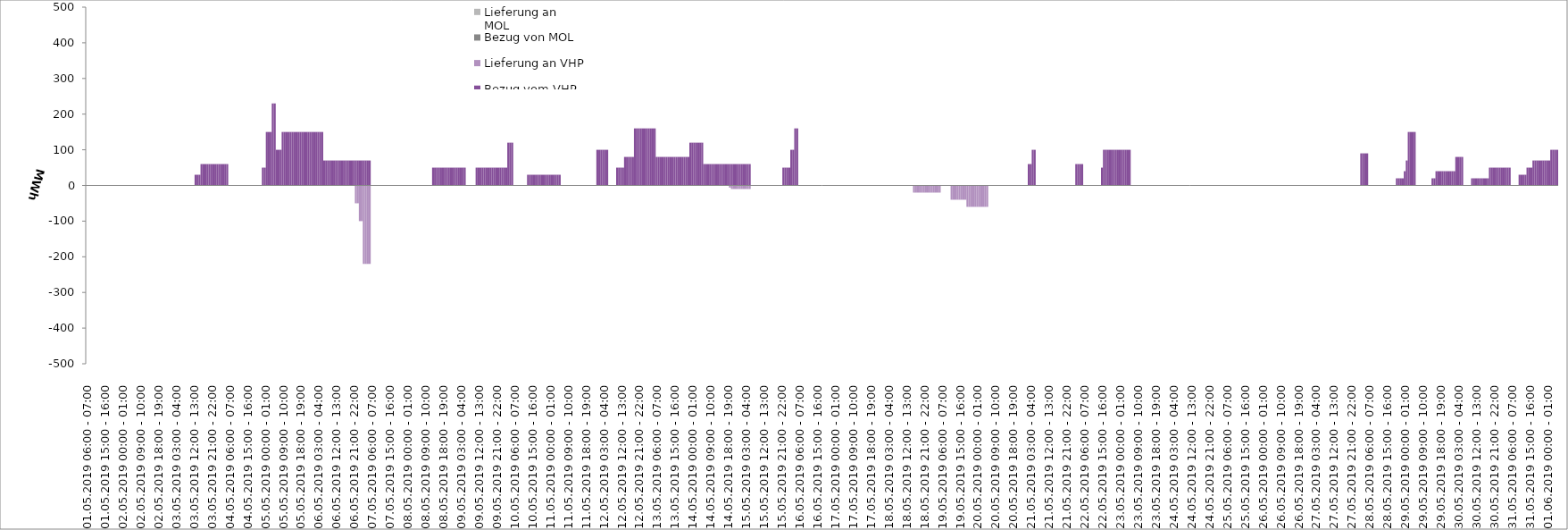
| Category | Bezug vom VHP | Lieferung an VHP | Bezug von MOL | Lieferung an MOL |
|---|---|---|---|---|
| 01.05.2019 06:00 - 07:00 | 0 | 0 | 0 | 0 |
| 01.05.2019 07:00 - 08:00 | 0 | 0 | 0 | 0 |
| 01.05.2019 08:00 - 09:00 | 0 | 0 | 0 | 0 |
| 01.05.2019 09:00 - 10:00 | 0 | 0 | 0 | 0 |
| 01.05.2019 10:00 - 11:00 | 0 | 0 | 0 | 0 |
| 01.05.2019 11:00 - 12:00 | 0 | 0 | 0 | 0 |
| 01.05.2019 12:00 - 13:00 | 0 | 0 | 0 | 0 |
| 01.05.2019 13:00 - 14:00 | 0 | 0 | 0 | 0 |
| 01.05.2019 14:00 - 15:00 | 0 | 0 | 0 | 0 |
| 01.05.2019 15:00 - 16:00 | 0 | 0 | 0 | 0 |
| 01.05.2019 16:00 - 17:00 | 0 | 0 | 0 | 0 |
| 01.05.2019 17:00 - 18:00 | 0 | 0 | 0 | 0 |
| 01.05.2019 18:00 - 19:00 | 0 | 0 | 0 | 0 |
| 01.05.2019 19:00 - 20:00 | 0 | 0 | 0 | 0 |
| 01.05.2019 20:00 - 21:00 | 0 | 0 | 0 | 0 |
| 01.05.2019 21:00 - 22:00 | 0 | 0 | 0 | 0 |
| 01.05.2019 22:00 - 23:00 | 0 | 0 | 0 | 0 |
| 01.05.2019 23:00 - 24:00 | 0 | 0 | 0 | 0 |
| 02.05.2019 00:00 - 01:00 | 0 | 0 | 0 | 0 |
| 02.05.2019 01:00 - 02:00 | 0 | 0 | 0 | 0 |
| 02.05.2019 02:00 - 03:00 | 0 | 0 | 0 | 0 |
| 02.05.2019 03:00 - 04:00 | 0 | 0 | 0 | 0 |
| 02.05.2019 04:00 - 05:00 | 0 | 0 | 0 | 0 |
| 02.05.2019 05:00 - 06:00 | 0 | 0 | 0 | 0 |
| 02.05.2019 06:00 - 07:00 | 0 | 0 | 0 | 0 |
| 02.05.2019 07:00 - 08:00 | 0 | 0 | 0 | 0 |
| 02.05.2019 08:00 - 09:00 | 0 | 0 | 0 | 0 |
| 02.05.2019 09:00 - 10:00 | 0 | 0 | 0 | 0 |
| 02.05.2019 10:00 - 11:00 | 0 | 0 | 0 | 0 |
| 02.05.2019 11:00 - 12:00 | 0 | 0 | 0 | 0 |
| 02.05.2019 12:00 - 13:00 | 0 | 0 | 0 | 0 |
| 02.05.2019 13:00 - 14:00 | 0 | 0 | 0 | 0 |
| 02.05.2019 14:00 - 15:00 | 0 | 0 | 0 | 0 |
| 02.05.2019 15:00 - 16:00 | 0 | 0 | 0 | 0 |
| 02.05.2019 16:00 - 17:00 | 0 | 0 | 0 | 0 |
| 02.05.2019 17:00 - 18:00 | 0 | 0 | 0 | 0 |
| 02.05.2019 18:00 - 19:00 | 0 | 0 | 0 | 0 |
| 02.05.2019 19:00 - 20:00 | 0 | 0 | 0 | 0 |
| 02.05.2019 20:00 - 21:00 | 0 | 0 | 0 | 0 |
| 02.05.2019 21:00 - 22:00 | 0 | 0 | 0 | 0 |
| 02.05.2019 22:00 - 23:00 | 0 | 0 | 0 | 0 |
| 02.05.2019 23:00 - 24:00 | 0 | 0 | 0 | 0 |
| 03.05.2019 00:00 - 01:00 | 0 | 0 | 0 | 0 |
| 03.05.2019 01:00 - 02:00 | 0 | 0 | 0 | 0 |
| 03.05.2019 02:00 - 03:00 | 0 | 0 | 0 | 0 |
| 03.05.2019 03:00 - 04:00 | 0 | 0 | 0 | 0 |
| 03.05.2019 04:00 - 05:00 | 0 | 0 | 0 | 0 |
| 03.05.2019 05:00 - 06:00 | 0 | 0 | 0 | 0 |
| 03.05.2019 06:00 - 07:00 | 0 | 0 | 0 | 0 |
| 03.05.2019 07:00 - 08:00 | 0 | 0 | 0 | 0 |
| 03.05.2019 08:00 - 09:00 | 0 | 0 | 0 | 0 |
| 03.05.2019 09:00 - 10:00 | 0 | 0 | 0 | 0 |
| 03.05.2019 10:00 - 11:00 | 0 | 0 | 0 | 0 |
| 03.05.2019 11:00 - 12:00 | 0 | 0 | 0 | 0 |
| 03.05.2019 12:00 - 13:00 | 0 | 0 | 0 | 0 |
| 03.05.2019 13:00 - 14:00 | 30 | 0 | 0 | 0 |
| 03.05.2019 14:00 - 15:00 | 30 | 0 | 0 | 0 |
| 03.05.2019 15:00 - 16:00 | 30 | 0 | 0 | 0 |
| 03.05.2019 16:00 - 17:00 | 60 | 0 | 0 | 0 |
| 03.05.2019 17:00 - 18:00 | 60 | 0 | 0 | 0 |
| 03.05.2019 18:00 - 19:00 | 60 | 0 | 0 | 0 |
| 03.05.2019 19:00 - 20:00 | 60 | 0 | 0 | 0 |
| 03.05.2019 20:00 - 21:00 | 60 | 0 | 0 | 0 |
| 03.05.2019 21:00 - 22:00 | 60 | 0 | 0 | 0 |
| 03.05.2019 22:00 - 23:00 | 60 | 0 | 0 | 0 |
| 03.05.2019 23:00 - 24:00 | 60 | 0 | 0 | 0 |
| 04.05.2019 00:00 - 01:00 | 60 | 0 | 0 | 0 |
| 04.05.2019 01:00 - 02:00 | 60 | 0 | 0 | 0 |
| 04.05.2019 02:00 - 03:00 | 60 | 0 | 0 | 0 |
| 04.05.2019 03:00 - 04:00 | 60 | 0 | 0 | 0 |
| 04.05.2019 04:00 - 05:00 | 60 | 0 | 0 | 0 |
| 04.05.2019 05:00 - 06:00 | 60 | 0 | 0 | 0 |
| 04.05.2019 06:00 - 07:00 | 0 | 0 | 0 | 0 |
| 04.05.2019 07:00 - 08:00 | 0 | 0 | 0 | 0 |
| 04.05.2019 08:00 - 09:00 | 0 | 0 | 0 | 0 |
| 04.05.2019 09:00 - 10:00 | 0 | 0 | 0 | 0 |
| 04.05.2019 10:00 - 11:00 | 0 | 0 | 0 | 0 |
| 04.05.2019 11:00 - 12:00 | 0 | 0 | 0 | 0 |
| 04.05.2019 12:00 - 13:00 | 0 | 0 | 0 | 0 |
| 04.05.2019 13:00 - 14:00 | 0 | 0 | 0 | 0 |
| 04.05.2019 14:00 - 15:00 | 0 | 0 | 0 | 0 |
| 04.05.2019 15:00 - 16:00 | 0 | 0 | 0 | 0 |
| 04.05.2019 16:00 - 17:00 | 0 | 0 | 0 | 0 |
| 04.05.2019 17:00 - 18:00 | 0 | 0 | 0 | 0 |
| 04.05.2019 18:00 - 19:00 | 0 | 0 | 0 | 0 |
| 04.05.2019 19:00 - 20:00 | 0 | 0 | 0 | 0 |
| 04.05.2019 20:00 - 21:00 | 0 | 0 | 0 | 0 |
| 04.05.2019 21:00 - 22:00 | 0 | 0 | 0 | 0 |
| 04.05.2019 22:00 - 23:00 | 0 | 0 | 0 | 0 |
| 04.05.2019 23:00 - 24:00 | 50 | 0 | 0 | 0 |
| 05.05.2019 00:00 - 01:00 | 50 | 0 | 0 | 0 |
| 05.05.2019 01:00 - 02:00 | 150 | 0 | 0 | 0 |
| 05.05.2019 02:00 - 03:00 | 150 | 0 | 0 | 0 |
| 05.05.2019 03:00 - 04:00 | 150 | 0 | 0 | 0 |
| 05.05.2019 04:00 - 05:00 | 230 | 0 | 0 | 0 |
| 05.05.2019 05:00 - 06:00 | 230 | 0 | 0 | 0 |
| 05.05.2019 06:00 - 07:00 | 100 | 0 | 0 | 0 |
| 05.05.2019 07:00 - 08:00 | 100 | 0 | 0 | 0 |
| 05.05.2019 08:00 - 09:00 | 100 | 0 | 0 | 0 |
| 05.05.2019 09:00 - 10:00 | 150 | 0 | 0 | 0 |
| 05.05.2019 10:00 - 11:00 | 150 | 0 | 0 | 0 |
| 05.05.2019 11:00 - 12:00 | 150 | 0 | 0 | 0 |
| 05.05.2019 12:00 - 13:00 | 150 | 0 | 0 | 0 |
| 05.05.2019 13:00 - 14:00 | 150 | 0 | 0 | 0 |
| 05.05.2019 14:00 - 15:00 | 150 | 0 | 0 | 0 |
| 05.05.2019 15:00 - 16:00 | 150 | 0 | 0 | 0 |
| 05.05.2019 16:00 - 17:00 | 150 | 0 | 0 | 0 |
| 05.05.2019 17:00 - 18:00 | 150 | 0 | 0 | 0 |
| 05.05.2019 18:00 - 19:00 | 150 | 0 | 0 | 0 |
| 05.05.2019 19:00 - 20:00 | 150 | 0 | 0 | 0 |
| 05.05.2019 20:00 - 21:00 | 150 | 0 | 0 | 0 |
| 05.05.2019 21:00 - 22:00 | 150 | 0 | 0 | 0 |
| 05.05.2019 22:00 - 23:00 | 150 | 0 | 0 | 0 |
| 05.05.2019 23:00 - 24:00 | 150 | 0 | 0 | 0 |
| 06.05.2019 00:00 - 01:00 | 150 | 0 | 0 | 0 |
| 06.05.2019 01:00 - 02:00 | 150 | 0 | 0 | 0 |
| 06.05.2019 02:00 - 03:00 | 150 | 0 | 0 | 0 |
| 06.05.2019 03:00 - 04:00 | 150 | 0 | 0 | 0 |
| 06.05.2019 04:00 - 05:00 | 150 | 0 | 0 | 0 |
| 06.05.2019 05:00 - 06:00 | 150 | 0 | 0 | 0 |
| 06.05.2019 06:00 - 07:00 | 70 | 0 | 0 | 0 |
| 06.05.2019 07:00 - 08:00 | 70 | 0 | 0 | 0 |
| 06.05.2019 08:00 - 09:00 | 70 | 0 | 0 | 0 |
| 06.05.2019 09:00 - 10:00 | 70 | 0 | 0 | 0 |
| 06.05.2019 10:00 - 11:00 | 70 | 0 | 0 | 0 |
| 06.05.2019 11:00 - 12:00 | 70 | 0 | 0 | 0 |
| 06.05.2019 12:00 - 13:00 | 70 | 0 | 0 | 0 |
| 06.05.2019 13:00 - 14:00 | 70 | 0 | 0 | 0 |
| 06.05.2019 14:00 - 15:00 | 70 | 0 | 0 | 0 |
| 06.05.2019 15:00 - 16:00 | 70 | 0 | 0 | 0 |
| 06.05.2019 16:00 - 17:00 | 70 | 0 | 0 | 0 |
| 06.05.2019 17:00 - 18:00 | 70 | 0 | 0 | 0 |
| 06.05.2019 18:00 - 19:00 | 70 | 0 | 0 | 0 |
| 06.05.2019 19:00 - 20:00 | 70 | 0 | 0 | 0 |
| 06.05.2019 20:00 - 21:00 | 70 | 0 | 0 | 0 |
| 06.05.2019 21:00 - 22:00 | 70 | 0 | 0 | 0 |
| 06.05.2019 22:00 - 23:00 | 70 | -50 | 0 | 0 |
| 06.05.2019 23:00 - 24:00 | 70 | -50 | 0 | 0 |
| 07.05.2019 00:00 - 01:00 | 70 | -100 | 0 | 0 |
| 07.05.2019 01:00 - 02:00 | 70 | -100 | 0 | 0 |
| 07.05.2019 02:00 - 03:00 | 70 | -220 | 0 | 0 |
| 07.05.2019 03:00 - 04:00 | 70 | -220 | 0 | 0 |
| 07.05.2019 04:00 - 05:00 | 70 | -220 | 0 | 0 |
| 07.05.2019 05:00 - 06:00 | 70 | -220 | 0 | 0 |
| 07.05.2019 06:00 - 07:00 | 0 | 0 | 0 | 0 |
| 07.05.2019 07:00 - 08:00 | 0 | 0 | 0 | 0 |
| 07.05.2019 08:00 - 09:00 | 0 | 0 | 0 | 0 |
| 07.05.2019 09:00 - 10:00 | 0 | 0 | 0 | 0 |
| 07.05.2019 10:00 - 11:00 | 0 | 0 | 0 | 0 |
| 07.05.2019 11:00 - 12:00 | 0 | 0 | 0 | 0 |
| 07.05.2019 12:00 - 13:00 | 0 | 0 | 0 | 0 |
| 07.05.2019 13:00 - 14:00 | 0 | 0 | 0 | 0 |
| 07.05.2019 14:00 - 15:00 | 0 | 0 | 0 | 0 |
| 07.05.2019 15:00 - 16:00 | 0 | 0 | 0 | 0 |
| 07.05.2019 16:00 - 17:00 | 0 | 0 | 0 | 0 |
| 07.05.2019 17:00 - 18:00 | 0 | 0 | 0 | 0 |
| 07.05.2019 18:00 - 19:00 | 0 | 0 | 0 | 0 |
| 07.05.2019 19:00 - 20:00 | 0 | 0 | 0 | 0 |
| 07.05.2019 20:00 - 21:00 | 0 | 0 | 0 | 0 |
| 07.05.2019 21:00 - 22:00 | 0 | 0 | 0 | 0 |
| 07.05.2019 22:00 - 23:00 | 0 | 0 | 0 | 0 |
| 07.05.2019 23:00 - 24:00 | 0 | 0 | 0 | 0 |
| 08.05.2019 00:00 - 01:00 | 0 | 0 | 0 | 0 |
| 08.05.2019 01:00 - 02:00 | 0 | 0 | 0 | 0 |
| 08.05.2019 02:00 - 03:00 | 0 | 0 | 0 | 0 |
| 08.05.2019 03:00 - 04:00 | 0 | 0 | 0 | 0 |
| 08.05.2019 04:00 - 05:00 | 0 | 0 | 0 | 0 |
| 08.05.2019 05:00 - 06:00 | 0 | 0 | 0 | 0 |
| 08.05.2019 06:00 - 07:00 | 0 | 0 | 0 | 0 |
| 08.05.2019 07:00 - 08:00 | 0 | 0 | 0 | 0 |
| 08.05.2019 08:00 - 09:00 | 0 | 0 | 0 | 0 |
| 08.05.2019 09:00 - 10:00 | 0 | 0 | 0 | 0 |
| 08.05.2019 10:00 - 11:00 | 0 | 0 | 0 | 0 |
| 08.05.2019 11:00 - 12:00 | 0 | 0 | 0 | 0 |
| 08.05.2019 12:00 - 13:00 | 0 | 0 | 0 | 0 |
| 08.05.2019 13:00 - 14:00 | 50 | 0 | 0 | 0 |
| 08.05.2019 14:00 - 15:00 | 50 | 0 | 0 | 0 |
| 08.05.2019 15:00 - 16:00 | 50 | 0 | 0 | 0 |
| 08.05.2019 16:00 - 17:00 | 50 | 0 | 0 | 0 |
| 08.05.2019 17:00 - 18:00 | 50 | 0 | 0 | 0 |
| 08.05.2019 18:00 - 19:00 | 50 | 0 | 0 | 0 |
| 08.05.2019 19:00 - 20:00 | 50 | 0 | 0 | 0 |
| 08.05.2019 20:00 - 21:00 | 50 | 0 | 0 | 0 |
| 08.05.2019 21:00 - 22:00 | 50 | 0 | 0 | 0 |
| 08.05.2019 22:00 - 23:00 | 50 | 0 | 0 | 0 |
| 08.05.2019 23:00 - 24:00 | 50 | 0 | 0 | 0 |
| 09.05.2019 00:00 - 01:00 | 50 | 0 | 0 | 0 |
| 09.05.2019 01:00 - 02:00 | 50 | 0 | 0 | 0 |
| 09.05.2019 02:00 - 03:00 | 50 | 0 | 0 | 0 |
| 09.05.2019 03:00 - 04:00 | 50 | 0 | 0 | 0 |
| 09.05.2019 04:00 - 05:00 | 50 | 0 | 0 | 0 |
| 09.05.2019 05:00 - 06:00 | 50 | 0 | 0 | 0 |
| 09.05.2019 06:00 - 07:00 | 0 | 0 | 0 | 0 |
| 09.05.2019 07:00 - 08:00 | 0 | 0 | 0 | 0 |
| 09.05.2019 08:00 - 09:00 | 0 | 0 | 0 | 0 |
| 09.05.2019 09:00 - 10:00 | 0 | 0 | 0 | 0 |
| 09.05.2019 10:00 - 11:00 | 0 | 0 | 0 | 0 |
| 09.05.2019 11:00 - 12:00 | 50 | 0 | 0 | 0 |
| 09.05.2019 12:00 - 13:00 | 50 | 0 | 0 | 0 |
| 09.05.2019 13:00 - 14:00 | 50 | 0 | 0 | 0 |
| 09.05.2019 14:00 - 15:00 | 50 | 0 | 0 | 0 |
| 09.05.2019 15:00 - 16:00 | 50 | 0 | 0 | 0 |
| 09.05.2019 16:00 - 17:00 | 50 | 0 | 0 | 0 |
| 09.05.2019 17:00 - 18:00 | 50 | 0 | 0 | 0 |
| 09.05.2019 18:00 - 19:00 | 50 | 0 | 0 | 0 |
| 09.05.2019 19:00 - 20:00 | 50 | 0 | 0 | 0 |
| 09.05.2019 20:00 - 21:00 | 50 | 0 | 0 | 0 |
| 09.05.2019 21:00 - 22:00 | 50 | 0 | 0 | 0 |
| 09.05.2019 22:00 - 23:00 | 50 | 0 | 0 | 0 |
| 09.05.2019 23:00 - 24:00 | 50 | 0 | 0 | 0 |
| 10.05.2019 00:00 - 01:00 | 50 | 0 | 0 | 0 |
| 10.05.2019 01:00 - 02:00 | 50 | 0 | 0 | 0 |
| 10.05.2019 02:00 - 03:00 | 50 | 0 | 0 | 0 |
| 10.05.2019 03:00 - 04:00 | 120 | 0 | 0 | 0 |
| 10.05.2019 04:00 - 05:00 | 120 | 0 | 0 | 0 |
| 10.05.2019 05:00 - 06:00 | 120 | 0 | 0 | 0 |
| 10.05.2019 06:00 - 07:00 | 0 | 0 | 0 | 0 |
| 10.05.2019 07:00 - 08:00 | 0 | 0 | 0 | 0 |
| 10.05.2019 08:00 - 09:00 | 0 | 0 | 0 | 0 |
| 10.05.2019 09:00 - 10:00 | 0 | 0 | 0 | 0 |
| 10.05.2019 10:00 - 11:00 | 0 | 0 | 0 | 0 |
| 10.05.2019 11:00 - 12:00 | 0 | 0 | 0 | 0 |
| 10.05.2019 12:00 - 13:00 | 0 | 0 | 0 | 0 |
| 10.05.2019 13:00 - 14:00 | 30 | 0 | 0 | 0 |
| 10.05.2019 14:00 - 15:00 | 30 | 0 | 0 | 0 |
| 10.05.2019 15:00 - 16:00 | 30 | 0 | 0 | 0 |
| 10.05.2019 16:00 - 17:00 | 30 | 0 | 0 | 0 |
| 10.05.2019 17:00 - 18:00 | 30 | 0 | 0 | 0 |
| 10.05.2019 18:00 - 19:00 | 30 | 0 | 0 | 0 |
| 10.05.2019 19:00 - 20:00 | 30 | 0 | 0 | 0 |
| 10.05.2019 20:00 - 21:00 | 30 | 0 | 0 | 0 |
| 10.05.2019 21:00 - 22:00 | 30 | 0 | 0 | 0 |
| 10.05.2019 22:00 - 23:00 | 30 | 0 | 0 | 0 |
| 10.05.2019 23:00 - 24:00 | 30 | 0 | 0 | 0 |
| 11.05.2019 00:00 - 01:00 | 30 | 0 | 0 | 0 |
| 11.05.2019 01:00 - 02:00 | 30 | 0 | 0 | 0 |
| 11.05.2019 02:00 - 03:00 | 30 | 0 | 0 | 0 |
| 11.05.2019 03:00 - 04:00 | 30 | 0 | 0 | 0 |
| 11.05.2019 04:00 - 05:00 | 30 | 0 | 0 | 0 |
| 11.05.2019 05:00 - 06:00 | 30 | 0 | 0 | 0 |
| 11.05.2019 06:00 - 07:00 | 0 | 0 | 0 | 0 |
| 11.05.2019 07:00 - 08:00 | 0 | 0 | 0 | 0 |
| 11.05.2019 08:00 - 09:00 | 0 | 0 | 0 | 0 |
| 11.05.2019 09:00 - 10:00 | 0 | 0 | 0 | 0 |
| 11.05.2019 10:00 - 11:00 | 0 | 0 | 0 | 0 |
| 11.05.2019 11:00 - 12:00 | 0 | 0 | 0 | 0 |
| 11.05.2019 12:00 - 13:00 | 0 | 0 | 0 | 0 |
| 11.05.2019 13:00 - 14:00 | 0 | 0 | 0 | 0 |
| 11.05.2019 14:00 - 15:00 | 0 | 0 | 0 | 0 |
| 11.05.2019 15:00 - 16:00 | 0 | 0 | 0 | 0 |
| 11.05.2019 16:00 - 17:00 | 0 | 0 | 0 | 0 |
| 11.05.2019 17:00 - 18:00 | 0 | 0 | 0 | 0 |
| 11.05.2019 18:00 - 19:00 | 0 | 0 | 0 | 0 |
| 11.05.2019 19:00 - 20:00 | 0 | 0 | 0 | 0 |
| 11.05.2019 20:00 - 21:00 | 0 | 0 | 0 | 0 |
| 11.05.2019 21:00 - 22:00 | 0 | 0 | 0 | 0 |
| 11.05.2019 22:00 - 23:00 | 0 | 0 | 0 | 0 |
| 11.05.2019 23:00 - 24:00 | 0 | 0 | 0 | 0 |
| 12.05.2019 00:00 - 01:00 | 100 | 0 | 0 | 0 |
| 12.05.2019 01:00 - 02:00 | 100 | 0 | 0 | 0 |
| 12.05.2019 02:00 - 03:00 | 100 | 0 | 0 | 0 |
| 12.05.2019 03:00 - 04:00 | 100 | 0 | 0 | 0 |
| 12.05.2019 04:00 - 05:00 | 100 | 0 | 0 | 0 |
| 12.05.2019 05:00 - 06:00 | 100 | 0 | 0 | 0 |
| 12.05.2019 06:00 - 07:00 | 0 | 0 | 0 | 0 |
| 12.05.2019 07:00 - 08:00 | 0 | 0 | 0 | 0 |
| 12.05.2019 08:00 - 09:00 | 0 | 0 | 0 | 0 |
| 12.05.2019 09:00 - 10:00 | 0 | 0 | 0 | 0 |
| 12.05.2019 10:00 - 11:00 | 50 | 0 | 0 | 0 |
| 12.05.2019 11:00 - 12:00 | 50 | 0 | 0 | 0 |
| 12.05.2019 12:00 - 13:00 | 50 | 0 | 0 | 0 |
| 12.05.2019 13:00 - 14:00 | 50 | 0 | 0 | 0 |
| 12.05.2019 14:00 - 15:00 | 80 | 0 | 0 | 0 |
| 12.05.2019 15:00 - 16:00 | 80 | 0 | 0 | 0 |
| 12.05.2019 16:00 - 17:00 | 80 | 0 | 0 | 0 |
| 12.05.2019 17:00 - 18:00 | 80 | 0 | 0 | 0 |
| 12.05.2019 18:00 - 19:00 | 80 | 0 | 0 | 0 |
| 12.05.2019 19:00 - 20:00 | 160 | 0 | 0 | 0 |
| 12.05.2019 20:00 - 21:00 | 160 | 0 | 0 | 0 |
| 12.05.2019 21:00 - 22:00 | 160 | 0 | 0 | 0 |
| 12.05.2019 22:00 - 23:00 | 160 | 0 | 0 | 0 |
| 12.05.2019 23:00 - 24:00 | 160 | 0 | 0 | 0 |
| 13.05.2019 00:00 - 01:00 | 160 | 0 | 0 | 0 |
| 13.05.2019 01:00 - 02:00 | 160 | 0 | 0 | 0 |
| 13.05.2019 02:00 - 03:00 | 160 | 0 | 0 | 0 |
| 13.05.2019 03:00 - 04:00 | 160 | 0 | 0 | 0 |
| 13.05.2019 04:00 - 05:00 | 160 | 0 | 0 | 0 |
| 13.05.2019 05:00 - 06:00 | 160 | 0 | 0 | 0 |
| 13.05.2019 06:00 - 07:00 | 80 | 0 | 0 | 0 |
| 13.05.2019 07:00 - 08:00 | 80 | 0 | 0 | 0 |
| 13.05.2019 08:00 - 09:00 | 80 | 0 | 0 | 0 |
| 13.05.2019 09:00 - 10:00 | 80 | 0 | 0 | 0 |
| 13.05.2019 10:00 - 11:00 | 80 | 0 | 0 | 0 |
| 13.05.2019 11:00 - 12:00 | 80 | 0 | 0 | 0 |
| 13.05.2019 12:00 - 13:00 | 80 | 0 | 0 | 0 |
| 13.05.2019 13:00 - 14:00 | 80 | 0 | 0 | 0 |
| 13.05.2019 14:00 - 15:00 | 80 | 0 | 0 | 0 |
| 13.05.2019 15:00 - 16:00 | 80 | 0 | 0 | 0 |
| 13.05.2019 16:00 - 17:00 | 80 | 0 | 0 | 0 |
| 13.05.2019 17:00 - 18:00 | 80 | 0 | 0 | 0 |
| 13.05.2019 18:00 - 19:00 | 80 | 0 | 0 | 0 |
| 13.05.2019 19:00 - 20:00 | 80 | 0 | 0 | 0 |
| 13.05.2019 20:00 - 21:00 | 80 | 0 | 0 | 0 |
| 13.05.2019 21:00 - 22:00 | 80 | 0 | 0 | 0 |
| 13.05.2019 22:00 - 23:00 | 80 | 0 | 0 | 0 |
| 13.05.2019 23:00 - 24:00 | 120 | 0 | 0 | 0 |
| 14.05.2019 00:00 - 01:00 | 120 | 0 | 0 | 0 |
| 14.05.2019 01:00 - 02:00 | 120 | 0 | 0 | 0 |
| 14.05.2019 02:00 - 03:00 | 120 | 0 | 0 | 0 |
| 14.05.2019 03:00 - 04:00 | 120 | 0 | 0 | 0 |
| 14.05.2019 04:00 - 05:00 | 120 | 0 | 0 | 0 |
| 14.05.2019 05:00 - 06:00 | 120 | 0 | 0 | 0 |
| 14.05.2019 06:00 - 07:00 | 60 | 0 | 0 | 0 |
| 14.05.2019 07:00 - 08:00 | 60 | 0 | 0 | 0 |
| 14.05.2019 08:00 - 09:00 | 60 | 0 | 0 | 0 |
| 14.05.2019 09:00 - 10:00 | 60 | 0 | 0 | 0 |
| 14.05.2019 10:00 - 11:00 | 60 | 0 | 0 | 0 |
| 14.05.2019 11:00 - 12:00 | 60 | 0 | 0 | 0 |
| 14.05.2019 12:00 - 13:00 | 60 | 0 | 0 | 0 |
| 14.05.2019 13:00 - 14:00 | 60 | 0 | 0 | 0 |
| 14.05.2019 14:00 - 15:00 | 60 | 0 | 0 | 0 |
| 14.05.2019 15:00 - 16:00 | 60 | 0 | 0 | 0 |
| 14.05.2019 16:00 - 17:00 | 60 | 0 | 0 | 0 |
| 14.05.2019 17:00 - 18:00 | 60 | 0 | 0 | 0 |
| 14.05.2019 18:00 - 19:00 | 60 | 0 | 0 | 0 |
| 14.05.2019 19:00 - 20:00 | 60 | -6 | 0 | 0 |
| 14.05.2019 20:00 - 21:00 | 60 | -10 | 0 | 0 |
| 14.05.2019 21:00 - 22:00 | 60 | -10 | 0 | 0 |
| 14.05.2019 22:00 - 23:00 | 60 | -10 | 0 | 0 |
| 14.05.2019 23:00 - 24:00 | 60 | -10 | 0 | 0 |
| 15.05.2019 00:00 - 01:00 | 60 | -10 | 0 | 0 |
| 15.05.2019 01:00 - 02:00 | 60 | -10 | 0 | 0 |
| 15.05.2019 02:00 - 03:00 | 60 | -10 | 0 | 0 |
| 15.05.2019 03:00 - 04:00 | 60 | -10 | 0 | 0 |
| 15.05.2019 04:00 - 05:00 | 60 | -10 | 0 | 0 |
| 15.05.2019 05:00 - 06:00 | 60 | -10 | 0 | 0 |
| 15.05.2019 06:00 - 07:00 | 0 | 0 | 0 | 0 |
| 15.05.2019 07:00 - 08:00 | 0 | 0 | 0 | 0 |
| 15.05.2019 08:00 - 09:00 | 0 | 0 | 0 | 0 |
| 15.05.2019 09:00 - 10:00 | 0 | 0 | 0 | 0 |
| 15.05.2019 10:00 - 11:00 | 0 | 0 | 0 | 0 |
| 15.05.2019 11:00 - 12:00 | 0 | 0 | 0 | 0 |
| 15.05.2019 12:00 - 13:00 | 0 | 0 | 0 | 0 |
| 15.05.2019 13:00 - 14:00 | 0 | 0 | 0 | 0 |
| 15.05.2019 14:00 - 15:00 | 0 | 0 | 0 | 0 |
| 15.05.2019 15:00 - 16:00 | 0 | 0 | 0 | 0 |
| 15.05.2019 16:00 - 17:00 | 0 | 0 | 0 | 0 |
| 15.05.2019 17:00 - 18:00 | 0 | 0 | 0 | 0 |
| 15.05.2019 18:00 - 19:00 | 0 | 0 | 0 | 0 |
| 15.05.2019 19:00 - 20:00 | 0 | 0 | 0 | 0 |
| 15.05.2019 20:00 - 21:00 | 0 | 0 | 0 | 0 |
| 15.05.2019 21:00 - 22:00 | 0 | 0 | 0 | 0 |
| 15.05.2019 22:00 - 23:00 | 50 | 0 | 0 | 0 |
| 15.05.2019 23:00 - 24:00 | 50 | 0 | 0 | 0 |
| 16.05.2019 00:00 - 01:00 | 50 | 0 | 0 | 0 |
| 16.05.2019 01:00 - 02:00 | 50 | 0 | 0 | 0 |
| 16.05.2019 02:00 - 03:00 | 100 | 0 | 0 | 0 |
| 16.05.2019 03:00 - 04:00 | 100 | 0 | 0 | 0 |
| 16.05.2019 04:00 - 05:00 | 160 | 0 | 0 | 0 |
| 16.05.2019 05:00 - 06:00 | 160 | 0 | 0 | 0 |
| 16.05.2019 06:00 - 07:00 | 0 | 0 | 0 | 0 |
| 16.05.2019 07:00 - 08:00 | 0 | 0 | 0 | 0 |
| 16.05.2019 08:00 - 09:00 | 0 | 0 | 0 | 0 |
| 16.05.2019 09:00 - 10:00 | 0 | 0 | 0 | 0 |
| 16.05.2019 10:00 - 11:00 | 0 | 0 | 0 | 0 |
| 16.05.2019 11:00 - 12:00 | 0 | 0 | 0 | 0 |
| 16.05.2019 12:00 - 13:00 | 0 | 0 | 0 | 0 |
| 16.05.2019 13:00 - 14:00 | 0 | 0 | 0 | 0 |
| 16.05.2019 14:00 - 15:00 | 0 | 0 | 0 | 0 |
| 16.05.2019 15:00 - 16:00 | 0 | 0 | 0 | 0 |
| 16.05.2019 16:00 - 17:00 | 0 | 0 | 0 | 0 |
| 16.05.2019 17:00 - 18:00 | 0 | 0 | 0 | 0 |
| 16.05.2019 18:00 - 19:00 | 0 | 0 | 0 | 0 |
| 16.05.2019 19:00 - 20:00 | 0 | 0 | 0 | 0 |
| 16.05.2019 20:00 - 21:00 | 0 | 0 | 0 | 0 |
| 16.05.2019 21:00 - 22:00 | 0 | 0 | 0 | 0 |
| 16.05.2019 22:00 - 23:00 | 0 | 0 | 0 | 0 |
| 16.05.2019 23:00 - 24:00 | 0 | 0 | 0 | 0 |
| 17.05.2019 00:00 - 01:00 | 0 | 0 | 0 | 0 |
| 17.05.2019 01:00 - 02:00 | 0 | 0 | 0 | 0 |
| 17.05.2019 02:00 - 03:00 | 0 | 0 | 0 | 0 |
| 17.05.2019 03:00 - 04:00 | 0 | 0 | 0 | 0 |
| 17.05.2019 04:00 - 05:00 | 0 | 0 | 0 | 0 |
| 17.05.2019 05:00 - 06:00 | 0 | 0 | 0 | 0 |
| 17.05.2019 06:00 - 07:00 | 0 | 0 | 0 | 0 |
| 17.05.2019 07:00 - 08:00 | 0 | 0 | 0 | 0 |
| 17.05.2019 08:00 - 09:00 | 0 | 0 | 0 | 0 |
| 17.05.2019 09:00 - 10:00 | 0 | 0 | 0 | 0 |
| 17.05.2019 10:00 - 11:00 | 0 | 0 | 0 | 0 |
| 17.05.2019 11:00 - 12:00 | 0 | 0 | 0 | 0 |
| 17.05.2019 12:00 - 13:00 | 0 | 0 | 0 | 0 |
| 17.05.2019 13:00 - 14:00 | 0 | 0 | 0 | 0 |
| 17.05.2019 14:00 - 15:00 | 0 | 0 | 0 | 0 |
| 17.05.2019 15:00 - 16:00 | 0 | 0 | 0 | 0 |
| 17.05.2019 16:00 - 17:00 | 0 | 0 | 0 | 0 |
| 17.05.2019 17:00 - 18:00 | 0 | 0 | 0 | 0 |
| 17.05.2019 18:00 - 19:00 | 0 | 0 | 0 | 0 |
| 17.05.2019 19:00 - 20:00 | 0 | 0 | 0 | 0 |
| 17.05.2019 20:00 - 21:00 | 0 | 0 | 0 | 0 |
| 17.05.2019 21:00 - 22:00 | 0 | 0 | 0 | 0 |
| 17.05.2019 22:00 - 23:00 | 0 | 0 | 0 | 0 |
| 17.05.2019 23:00 - 24:00 | 0 | 0 | 0 | 0 |
| 18.05.2019 00:00 - 01:00 | 0 | 0 | 0 | 0 |
| 18.05.2019 01:00 - 02:00 | 0 | 0 | 0 | 0 |
| 18.05.2019 02:00 - 03:00 | 0 | 0 | 0 | 0 |
| 18.05.2019 03:00 - 04:00 | 0 | 0 | 0 | 0 |
| 18.05.2019 04:00 - 05:00 | 0 | 0 | 0 | 0 |
| 18.05.2019 05:00 - 06:00 | 0 | 0 | 0 | 0 |
| 18.05.2019 06:00 - 07:00 | 0 | 0 | 0 | 0 |
| 18.05.2019 07:00 - 08:00 | 0 | 0 | 0 | 0 |
| 18.05.2019 08:00 - 09:00 | 0 | 0 | 0 | 0 |
| 18.05.2019 09:00 - 10:00 | 0 | 0 | 0 | 0 |
| 18.05.2019 10:00 - 11:00 | 0 | 0 | 0 | 0 |
| 18.05.2019 11:00 - 12:00 | 0 | 0 | 0 | 0 |
| 18.05.2019 12:00 - 13:00 | 0 | 0 | 0 | 0 |
| 18.05.2019 13:00 - 14:00 | 0 | 0 | 0 | 0 |
| 18.05.2019 14:00 - 15:00 | 0 | 0 | 0 | 0 |
| 18.05.2019 15:00 - 16:00 | 0 | 0 | 0 | 0 |
| 18.05.2019 16:00 - 17:00 | 0 | -20 | 0 | 0 |
| 18.05.2019 17:00 - 18:00 | 0 | -20 | 0 | 0 |
| 18.05.2019 18:00 - 19:00 | 0 | -20 | 0 | 0 |
| 18.05.2019 19:00 - 20:00 | 0 | -20 | 0 | 0 |
| 18.05.2019 20:00 - 21:00 | 0 | -20 | 0 | 0 |
| 18.05.2019 21:00 - 22:00 | 0 | -20 | 0 | 0 |
| 18.05.2019 22:00 - 23:00 | 0 | -20 | 0 | 0 |
| 18.05.2019 23:00 - 24:00 | 0 | -20 | 0 | 0 |
| 19.05.2019 00:00 - 01:00 | 0 | -20 | 0 | 0 |
| 19.05.2019 01:00 - 02:00 | 0 | -20 | 0 | 0 |
| 19.05.2019 02:00 - 03:00 | 0 | -20 | 0 | 0 |
| 19.05.2019 03:00 - 04:00 | 0 | -20 | 0 | 0 |
| 19.05.2019 04:00 - 05:00 | 0 | -20 | 0 | 0 |
| 19.05.2019 05:00 - 06:00 | 0 | -20 | 0 | 0 |
| 19.05.2019 06:00 - 07:00 | 0 | 0 | 0 | 0 |
| 19.05.2019 07:00 - 08:00 | 0 | 0 | 0 | 0 |
| 19.05.2019 08:00 - 09:00 | 0 | 0 | 0 | 0 |
| 19.05.2019 09:00 - 10:00 | 0 | 0 | 0 | 0 |
| 19.05.2019 10:00 - 11:00 | 0 | 0 | 0 | 0 |
| 19.05.2019 11:00 - 12:00 | 0 | -40 | 0 | 0 |
| 19.05.2019 12:00 - 13:00 | 0 | -40 | 0 | 0 |
| 19.05.2019 13:00 - 14:00 | 0 | -40 | 0 | 0 |
| 19.05.2019 14:00 - 15:00 | 0 | -40 | 0 | 0 |
| 19.05.2019 15:00 - 16:00 | 0 | -40 | 0 | 0 |
| 19.05.2019 16:00 - 17:00 | 0 | -40 | 0 | 0 |
| 19.05.2019 17:00 - 18:00 | 0 | -40 | 0 | 0 |
| 19.05.2019 18:00 - 19:00 | 0 | -40 | 0 | 0 |
| 19.05.2019 19:00 - 20:00 | 0 | -60 | 0 | 0 |
| 19.05.2019 20:00 - 21:00 | 0 | -60 | 0 | 0 |
| 19.05.2019 21:00 - 22:00 | 0 | -60 | 0 | 0 |
| 19.05.2019 22:00 - 23:00 | 0 | -60 | 0 | 0 |
| 19.05.2019 23:00 - 24:00 | 0 | -60 | 0 | 0 |
| 20.05.2019 00:00 - 01:00 | 0 | -60 | 0 | 0 |
| 20.05.2019 01:00 - 02:00 | 0 | -60 | 0 | 0 |
| 20.05.2019 02:00 - 03:00 | 0 | -60 | 0 | 0 |
| 20.05.2019 03:00 - 04:00 | 0 | -60 | 0 | 0 |
| 20.05.2019 04:00 - 05:00 | 0 | -60 | 0 | 0 |
| 20.05.2019 05:00 - 06:00 | 0 | -60 | 0 | 0 |
| 20.05.2019 06:00 - 07:00 | 0 | 0 | 0 | 0 |
| 20.05.2019 07:00 - 08:00 | 0 | 0 | 0 | 0 |
| 20.05.2019 08:00 - 09:00 | 0 | 0 | 0 | 0 |
| 20.05.2019 09:00 - 10:00 | 0 | 0 | 0 | 0 |
| 20.05.2019 10:00 - 11:00 | 0 | 0 | 0 | 0 |
| 20.05.2019 11:00 - 12:00 | 0 | 0 | 0 | 0 |
| 20.05.2019 12:00 - 13:00 | 0 | 0 | 0 | 0 |
| 20.05.2019 13:00 - 14:00 | 0 | 0 | 0 | 0 |
| 20.05.2019 14:00 - 15:00 | 0 | 0 | 0 | 0 |
| 20.05.2019 15:00 - 16:00 | 0 | 0 | 0 | 0 |
| 20.05.2019 16:00 - 17:00 | 0 | 0 | 0 | 0 |
| 20.05.2019 17:00 - 18:00 | 0 | 0 | 0 | 0 |
| 20.05.2019 18:00 - 19:00 | 0 | 0 | 0 | 0 |
| 20.05.2019 19:00 - 20:00 | 0 | 0 | 0 | 0 |
| 20.05.2019 20:00 - 21:00 | 0 | 0 | 0 | 0 |
| 20.05.2019 21:00 - 22:00 | 0 | 0 | 0 | 0 |
| 20.05.2019 22:00 - 23:00 | 0 | 0 | 0 | 0 |
| 20.05.2019 23:00 - 24:00 | 0 | 0 | 0 | 0 |
| 21.05.2019 00:00 - 01:00 | 0 | 0 | 0 | 0 |
| 21.05.2019 01:00 - 02:00 | 0 | 0 | 0 | 0 |
| 21.05.2019 02:00 - 03:00 | 60 | 0 | 0 | 0 |
| 21.05.2019 03:00 - 04:00 | 60 | 0 | 0 | 0 |
| 21.05.2019 04:00 - 05:00 | 100 | 0 | 0 | 0 |
| 21.05.2019 05:00 - 06:00 | 100 | 0 | 0 | 0 |
| 21.05.2019 06:00 - 07:00 | 0 | 0 | 0 | 0 |
| 21.05.2019 07:00 - 08:00 | 0 | 0 | 0 | 0 |
| 21.05.2019 08:00 - 09:00 | 0 | 0 | 0 | 0 |
| 21.05.2019 09:00 - 10:00 | 0 | 0 | 0 | 0 |
| 21.05.2019 10:00 - 11:00 | 0 | 0 | 0 | 0 |
| 21.05.2019 11:00 - 12:00 | 0 | 0 | 0 | 0 |
| 21.05.2019 12:00 - 13:00 | 0 | 0 | 0 | 0 |
| 21.05.2019 13:00 - 14:00 | 0 | 0 | 0 | 0 |
| 21.05.2019 14:00 - 15:00 | 0 | 0 | 0 | 0 |
| 21.05.2019 15:00 - 16:00 | 0 | 0 | 0 | 0 |
| 21.05.2019 16:00 - 17:00 | 0 | 0 | 0 | 0 |
| 21.05.2019 17:00 - 18:00 | 0 | 0 | 0 | 0 |
| 21.05.2019 18:00 - 19:00 | 0 | 0 | 0 | 0 |
| 21.05.2019 19:00 - 20:00 | 0 | 0 | 0 | 0 |
| 21.05.2019 20:00 - 21:00 | 0 | 0 | 0 | 0 |
| 21.05.2019 21:00 - 22:00 | 0 | 0 | 0 | 0 |
| 21.05.2019 22:00 - 23:00 | 0 | 0 | 0 | 0 |
| 21.05.2019 23:00 - 24:00 | 0 | 0 | 0 | 0 |
| 22.05.2019 00:00 - 01:00 | 0 | 0 | 0 | 0 |
| 22.05.2019 01:00 - 02:00 | 0 | 0 | 0 | 0 |
| 22.05.2019 02:00 - 03:00 | 60 | 0 | 0 | 0 |
| 22.05.2019 03:00 - 04:00 | 60 | 0 | 0 | 0 |
| 22.05.2019 04:00 - 05:00 | 60 | 0 | 0 | 0 |
| 22.05.2019 05:00 - 06:00 | 60 | 0 | 0 | 0 |
| 22.05.2019 06:00 - 07:00 | 0 | 0 | 0 | 0 |
| 22.05.2019 07:00 - 08:00 | 0 | 0 | 0 | 0 |
| 22.05.2019 08:00 - 09:00 | 0 | 0 | 0 | 0 |
| 22.05.2019 09:00 - 10:00 | 0 | 0 | 0 | 0 |
| 22.05.2019 10:00 - 11:00 | 0 | 0 | 0 | 0 |
| 22.05.2019 11:00 - 12:00 | 0 | 0 | 0 | 0 |
| 22.05.2019 12:00 - 13:00 | 0 | 0 | 0 | 0 |
| 22.05.2019 13:00 - 14:00 | 0 | 0 | 0 | 0 |
| 22.05.2019 14:00 - 15:00 | 0 | 0 | 0 | 0 |
| 22.05.2019 15:00 - 16:00 | 50 | 0 | 0 | 0 |
| 22.05.2019 16:00 - 17:00 | 100 | 0 | 0 | 0 |
| 22.05.2019 17:00 - 18:00 | 100 | 0 | 0 | 0 |
| 22.05.2019 18:00 - 19:00 | 100 | 0 | 0 | 0 |
| 22.05.2019 19:00 - 20:00 | 100 | 0 | 0 | 0 |
| 22.05.2019 20:00 - 21:00 | 100 | 0 | 0 | 0 |
| 22.05.2019 21:00 - 22:00 | 100 | 0 | 0 | 0 |
| 22.05.2019 22:00 - 23:00 | 100 | 0 | 0 | 0 |
| 22.05.2019 23:00 - 24:00 | 100 | 0 | 0 | 0 |
| 23.05.2019 00:00 - 01:00 | 100 | 0 | 0 | 0 |
| 23.05.2019 01:00 - 02:00 | 100 | 0 | 0 | 0 |
| 23.05.2019 02:00 - 03:00 | 100 | 0 | 0 | 0 |
| 23.05.2019 03:00 - 04:00 | 100 | 0 | 0 | 0 |
| 23.05.2019 04:00 - 05:00 | 100 | 0 | 0 | 0 |
| 23.05.2019 05:00 - 06:00 | 100 | 0 | 0 | 0 |
| 23.05.2019 06:00 - 07:00 | 0 | 0 | 0 | 0 |
| 23.05.2019 07:00 - 08:00 | 0 | 0 | 0 | 0 |
| 23.05.2019 08:00 - 09:00 | 0 | 0 | 0 | 0 |
| 23.05.2019 09:00 - 10:00 | 0 | 0 | 0 | 0 |
| 23.05.2019 10:00 - 11:00 | 0 | 0 | 0 | 0 |
| 23.05.2019 11:00 - 12:00 | 0 | 0 | 0 | 0 |
| 23.05.2019 12:00 - 13:00 | 0 | 0 | 0 | 0 |
| 23.05.2019 13:00 - 14:00 | 0 | 0 | 0 | 0 |
| 23.05.2019 14:00 - 15:00 | 0 | 0 | 0 | 0 |
| 23.05.2019 15:00 - 16:00 | 0 | 0 | 0 | 0 |
| 23.05.2019 16:00 - 17:00 | 0 | 0 | 0 | 0 |
| 23.05.2019 17:00 - 18:00 | 0 | 0 | 0 | 0 |
| 23.05.2019 18:00 - 19:00 | 0 | 0 | 0 | 0 |
| 23.05.2019 19:00 - 20:00 | 0 | 0 | 0 | 0 |
| 23.05.2019 20:00 - 21:00 | 0 | 0 | 0 | 0 |
| 23.05.2019 21:00 - 22:00 | 0 | 0 | 0 | 0 |
| 23.05.2019 22:00 - 23:00 | 0 | 0 | 0 | 0 |
| 23.05.2019 23:00 - 24:00 | 0 | 0 | 0 | 0 |
| 24.05.2019 00:00 - 01:00 | 0 | 0 | 0 | 0 |
| 24.05.2019 01:00 - 02:00 | 0 | 0 | 0 | 0 |
| 24.05.2019 02:00 - 03:00 | 0 | 0 | 0 | 0 |
| 24.05.2019 03:00 - 04:00 | 0 | 0 | 0 | 0 |
| 24.05.2019 04:00 - 05:00 | 0 | 0 | 0 | 0 |
| 24.05.2019 05:00 - 06:00 | 0 | 0 | 0 | 0 |
| 24.05.2019 06:00 - 07:00 | 0 | 0 | 0 | 0 |
| 24.05.2019 07:00 - 08:00 | 0 | 0 | 0 | 0 |
| 24.05.2019 08:00 - 09:00 | 0 | 0 | 0 | 0 |
| 24.05.2019 09:00 - 10:00 | 0 | 0 | 0 | 0 |
| 24.05.2019 10:00 - 11:00 | 0 | 0 | 0 | 0 |
| 24.05.2019 11:00 - 12:00 | 0 | 0 | 0 | 0 |
| 24.05.2019 12:00 - 13:00 | 0 | 0 | 0 | 0 |
| 24.05.2019 13:00 - 14:00 | 0 | 0 | 0 | 0 |
| 24.05.2019 14:00 - 15:00 | 0 | 0 | 0 | 0 |
| 24.05.2019 15:00 - 16:00 | 0 | 0 | 0 | 0 |
| 24.05.2019 16:00 - 17:00 | 0 | 0 | 0 | 0 |
| 24.05.2019 17:00 - 18:00 | 0 | 0 | 0 | 0 |
| 24.05.2019 18:00 - 19:00 | 0 | 0 | 0 | 0 |
| 24.05.2019 19:00 - 20:00 | 0 | 0 | 0 | 0 |
| 24.05.2019 20:00 - 21:00 | 0 | 0 | 0 | 0 |
| 24.05.2019 21:00 - 22:00 | 0 | 0 | 0 | 0 |
| 24.05.2019 22:00 - 23:00 | 0 | 0 | 0 | 0 |
| 24.05.2019 23:00 - 24:00 | 0 | 0 | 0 | 0 |
| 25.05.2019 00:00 - 01:00 | 0 | 0 | 0 | 0 |
| 25.05.2019 01:00 - 02:00 | 0 | 0 | 0 | 0 |
| 25.05.2019 02:00 - 03:00 | 0 | 0 | 0 | 0 |
| 25.05.2019 03:00 - 04:00 | 0 | 0 | 0 | 0 |
| 25.05.2019 04:00 - 05:00 | 0 | 0 | 0 | 0 |
| 25.05.2019 05:00 - 06:00 | 0 | 0 | 0 | 0 |
| 25.05.2019 06:00 - 07:00 | 0 | 0 | 0 | 0 |
| 25.05.2019 07:00 - 08:00 | 0 | 0 | 0 | 0 |
| 25.05.2019 08:00 - 09:00 | 0 | 0 | 0 | 0 |
| 25.05.2019 09:00 - 10:00 | 0 | 0 | 0 | 0 |
| 25.05.2019 10:00 - 11:00 | 0 | 0 | 0 | 0 |
| 25.05.2019 11:00 - 12:00 | 0 | 0 | 0 | 0 |
| 25.05.2019 12:00 - 13:00 | 0 | 0 | 0 | 0 |
| 25.05.2019 13:00 - 14:00 | 0 | 0 | 0 | 0 |
| 25.05.2019 14:00 - 15:00 | 0 | 0 | 0 | 0 |
| 25.05.2019 15:00 - 16:00 | 0 | 0 | 0 | 0 |
| 25.05.2019 16:00 - 17:00 | 0 | 0 | 0 | 0 |
| 25.05.2019 17:00 - 18:00 | 0 | 0 | 0 | 0 |
| 25.05.2019 18:00 - 19:00 | 0 | 0 | 0 | 0 |
| 25.05.2019 19:00 - 20:00 | 0 | 0 | 0 | 0 |
| 25.05.2019 20:00 - 21:00 | 0 | 0 | 0 | 0 |
| 25.05.2019 21:00 - 22:00 | 0 | 0 | 0 | 0 |
| 25.05.2019 22:00 - 23:00 | 0 | 0 | 0 | 0 |
| 25.05.2019 23:00 - 24:00 | 0 | 0 | 0 | 0 |
| 26.05.2019 00:00 - 01:00 | 0 | 0 | 0 | 0 |
| 26.05.2019 01:00 - 02:00 | 0 | 0 | 0 | 0 |
| 26.05.2019 02:00 - 03:00 | 0 | 0 | 0 | 0 |
| 26.05.2019 03:00 - 04:00 | 0 | 0 | 0 | 0 |
| 26.05.2019 04:00 - 05:00 | 0 | 0 | 0 | 0 |
| 26.05.2019 05:00 - 06:00 | 0 | 0 | 0 | 0 |
| 26.05.2019 06:00 - 07:00 | 0 | 0 | 0 | 0 |
| 26.05.2019 07:00 - 08:00 | 0 | 0 | 0 | 0 |
| 26.05.2019 08:00 - 09:00 | 0 | 0 | 0 | 0 |
| 26.05.2019 09:00 - 10:00 | 0 | 0 | 0 | 0 |
| 26.05.2019 10:00 - 11:00 | 0 | 0 | 0 | 0 |
| 26.05.2019 11:00 - 12:00 | 0 | 0 | 0 | 0 |
| 26.05.2019 12:00 - 13:00 | 0 | 0 | 0 | 0 |
| 26.05.2019 13:00 - 14:00 | 0 | 0 | 0 | 0 |
| 26.05.2019 14:00 - 15:00 | 0 | 0 | 0 | 0 |
| 26.05.2019 15:00 - 16:00 | 0 | 0 | 0 | 0 |
| 26.05.2019 16:00 - 17:00 | 0 | 0 | 0 | 0 |
| 26.05.2019 17:00 - 18:00 | 0 | 0 | 0 | 0 |
| 26.05.2019 18:00 - 19:00 | 0 | 0 | 0 | 0 |
| 26.05.2019 19:00 - 20:00 | 0 | 0 | 0 | 0 |
| 26.05.2019 20:00 - 21:00 | 0 | 0 | 0 | 0 |
| 26.05.2019 21:00 - 22:00 | 0 | 0 | 0 | 0 |
| 26.05.2019 22:00 - 23:00 | 0 | 0 | 0 | 0 |
| 26.05.2019 23:00 - 24:00 | 0 | 0 | 0 | 0 |
| 27.05.2019 00:00 - 01:00 | 0 | 0 | 0 | 0 |
| 27.05.2019 01:00 - 02:00 | 0 | 0 | 0 | 0 |
| 27.05.2019 02:00 - 03:00 | 0 | 0 | 0 | 0 |
| 27.05.2019 03:00 - 04:00 | 0 | 0 | 0 | 0 |
| 27.05.2019 04:00 - 05:00 | 0 | 0 | 0 | 0 |
| 27.05.2019 05:00 - 06:00 | 0 | 0 | 0 | 0 |
| 27.05.2019 06:00 - 07:00 | 0 | 0 | 0 | 0 |
| 27.05.2019 07:00 - 08:00 | 0 | 0 | 0 | 0 |
| 27.05.2019 08:00 - 09:00 | 0 | 0 | 0 | 0 |
| 27.05.2019 09:00 - 10:00 | 0 | 0 | 0 | 0 |
| 27.05.2019 10:00 - 11:00 | 0 | 0 | 0 | 0 |
| 27.05.2019 11:00 - 12:00 | 0 | 0 | 0 | 0 |
| 27.05.2019 12:00 - 13:00 | 0 | 0 | 0 | 0 |
| 27.05.2019 13:00 - 14:00 | 0 | 0 | 0 | 0 |
| 27.05.2019 14:00 - 15:00 | 0 | 0 | 0 | 0 |
| 27.05.2019 15:00 - 16:00 | 0 | 0 | 0 | 0 |
| 27.05.2019 16:00 - 17:00 | 0 | 0 | 0 | 0 |
| 27.05.2019 17:00 - 18:00 | 0 | 0 | 0 | 0 |
| 27.05.2019 18:00 - 19:00 | 0 | 0 | 0 | 0 |
| 27.05.2019 19:00 - 20:00 | 0 | 0 | 0 | 0 |
| 27.05.2019 20:00 - 21:00 | 0 | 0 | 0 | 0 |
| 27.05.2019 21:00 - 22:00 | 0 | 0 | 0 | 0 |
| 27.05.2019 22:00 - 23:00 | 0 | 0 | 0 | 0 |
| 27.05.2019 23:00 - 24:00 | 0 | 0 | 0 | 0 |
| 28.05.2019 00:00 - 01:00 | 0 | 0 | 0 | 0 |
| 28.05.2019 01:00 - 02:00 | 0 | 0 | 0 | 0 |
| 28.05.2019 02:00 - 03:00 | 90 | 0 | 0 | 0 |
| 28.05.2019 03:00 - 04:00 | 90 | 0 | 0 | 0 |
| 28.05.2019 04:00 - 05:00 | 90 | 0 | 0 | 0 |
| 28.05.2019 05:00 - 06:00 | 90 | 0 | 0 | 0 |
| 28.05.2019 06:00 - 07:00 | 0 | 0 | 0 | 0 |
| 28.05.2019 07:00 - 08:00 | 0 | 0 | 0 | 0 |
| 28.05.2019 08:00 - 09:00 | 0 | 0 | 0 | 0 |
| 28.05.2019 09:00 - 10:00 | 0 | 0 | 0 | 0 |
| 28.05.2019 10:00 - 11:00 | 0 | 0 | 0 | 0 |
| 28.05.2019 11:00 - 12:00 | 0 | 0 | 0 | 0 |
| 28.05.2019 12:00 - 13:00 | 0 | 0 | 0 | 0 |
| 28.05.2019 13:00 - 14:00 | 0 | 0 | 0 | 0 |
| 28.05.2019 14:00 - 15:00 | 0 | 0 | 0 | 0 |
| 28.05.2019 15:00 - 16:00 | 0 | 0 | 0 | 0 |
| 28.05.2019 16:00 - 17:00 | 0 | 0 | 0 | 0 |
| 28.05.2019 17:00 - 18:00 | 0 | 0 | 0 | 0 |
| 28.05.2019 18:00 - 19:00 | 0 | 0 | 0 | 0 |
| 28.05.2019 19:00 - 20:00 | 0 | 0 | 0 | 0 |
| 28.05.2019 20:00 - 21:00 | 20 | 0 | 0 | 0 |
| 28.05.2019 21:00 - 22:00 | 20 | 0 | 0 | 0 |
| 28.05.2019 22:00 - 23:00 | 20 | 0 | 0 | 0 |
| 28.05.2019 23:00 - 24:00 | 20 | 0 | 0 | 0 |
| 29.05.2019 00:00 - 01:00 | 40 | 0 | 0 | 0 |
| 29.05.2019 01:00 - 02:00 | 70 | 0 | 0 | 0 |
| 29.05.2019 02:00 - 03:00 | 150 | 0 | 0 | 0 |
| 29.05.2019 03:00 - 04:00 | 150 | 0 | 0 | 0 |
| 29.05.2019 04:00 - 05:00 | 150 | 0 | 0 | 0 |
| 29.05.2019 05:00 - 06:00 | 150 | 0 | 0 | 0 |
| 29.05.2019 06:00 - 07:00 | 0 | 0 | 0 | 0 |
| 29.05.2019 07:00 - 08:00 | 0 | 0 | 0 | 0 |
| 29.05.2019 08:00 - 09:00 | 0 | 0 | 0 | 0 |
| 29.05.2019 09:00 - 10:00 | 0 | 0 | 0 | 0 |
| 29.05.2019 10:00 - 11:00 | 0 | 0 | 0 | 0 |
| 29.05.2019 11:00 - 12:00 | 0 | 0 | 0 | 0 |
| 29.05.2019 12:00 - 13:00 | 0 | 0 | 0 | 0 |
| 29.05.2019 13:00 - 14:00 | 0 | 0 | 0 | 0 |
| 29.05.2019 14:00 - 15:00 | 20 | 0 | 0 | 0 |
| 29.05.2019 15:00 - 16:00 | 20 | 0 | 0 | 0 |
| 29.05.2019 16:00 - 17:00 | 40 | 0 | 0 | 0 |
| 29.05.2019 17:00 - 18:00 | 40 | 0 | 0 | 0 |
| 29.05.2019 18:00 - 19:00 | 40 | 0 | 0 | 0 |
| 29.05.2019 19:00 - 20:00 | 40 | 0 | 0 | 0 |
| 29.05.2019 20:00 - 21:00 | 40 | 0 | 0 | 0 |
| 29.05.2019 21:00 - 22:00 | 40 | 0 | 0 | 0 |
| 29.05.2019 22:00 - 23:00 | 40 | 0 | 0 | 0 |
| 29.05.2019 23:00 - 24:00 | 40 | 0 | 0 | 0 |
| 30.05.2019 00:00 - 01:00 | 40 | 0 | 0 | 0 |
| 30.05.2019 01:00 - 02:00 | 40 | 0 | 0 | 0 |
| 30.05.2019 02:00 - 03:00 | 80 | 0 | 0 | 0 |
| 30.05.2019 03:00 - 04:00 | 80 | 0 | 0 | 0 |
| 30.05.2019 04:00 - 05:00 | 80 | 0 | 0 | 0 |
| 30.05.2019 05:00 - 06:00 | 80 | 0 | 0 | 0 |
| 30.05.2019 06:00 - 07:00 | 0 | 0 | 0 | 0 |
| 30.05.2019 07:00 - 08:00 | 0 | 0 | 0 | 0 |
| 30.05.2019 08:00 - 09:00 | 0 | 0 | 0 | 0 |
| 30.05.2019 09:00 - 10:00 | 0 | 0 | 0 | 0 |
| 30.05.2019 10:00 - 11:00 | 20 | 0 | 0 | 0 |
| 30.05.2019 11:00 - 12:00 | 20 | 0 | 0 | 0 |
| 30.05.2019 12:00 - 13:00 | 20 | 0 | 0 | 0 |
| 30.05.2019 13:00 - 14:00 | 20 | 0 | 0 | 0 |
| 30.05.2019 14:00 - 15:00 | 20 | 0 | 0 | 0 |
| 30.05.2019 15:00 - 16:00 | 20 | 0 | 0 | 0 |
| 30.05.2019 16:00 - 17:00 | 20 | 0 | 0 | 0 |
| 30.05.2019 17:00 - 18:00 | 20 | 0 | 0 | 0 |
| 30.05.2019 18:00 - 19:00 | 20 | 0 | 0 | 0 |
| 30.05.2019 19:00 - 20:00 | 50 | 0 | 0 | 0 |
| 30.05.2019 20:00 - 21:00 | 50 | 0 | 0 | 0 |
| 30.05.2019 21:00 - 22:00 | 50 | 0 | 0 | 0 |
| 30.05.2019 22:00 - 23:00 | 50 | 0 | 0 | 0 |
| 30.05.2019 23:00 - 24:00 | 50 | 0 | 0 | 0 |
| 31.05.2019 00:00 - 01:00 | 50 | 0 | 0 | 0 |
| 31.05.2019 01:00 - 02:00 | 50 | 0 | 0 | 0 |
| 31.05.2019 02:00 - 03:00 | 50 | 0 | 0 | 0 |
| 31.05.2019 03:00 - 04:00 | 50 | 0 | 0 | 0 |
| 31.05.2019 04:00 - 05:00 | 50 | 0 | 0 | 0 |
| 31.05.2019 05:00 - 06:00 | 50 | 0 | 0 | 0 |
| 31.05.2019 06:00 - 07:00 | 0 | 0 | 0 | 0 |
| 31.05.2019 07:00 - 08:00 | 0 | 0 | 0 | 0 |
| 31.05.2019 08:00 - 09:00 | 0 | 0 | 0 | 0 |
| 31.05.2019 09:00 - 10:00 | 0 | 0 | 0 | 0 |
| 31.05.2019 10:00 - 11:00 | 30 | 0 | 0 | 0 |
| 31.05.2019 11:00 - 12:00 | 30 | 0 | 0 | 0 |
| 31.05.2019 12:00 - 13:00 | 30 | 0 | 0 | 0 |
| 31.05.2019 13:00 - 14:00 | 30 | 0 | 0 | 0 |
| 31.05.2019 14:00 - 15:00 | 50 | 0 | 0 | 0 |
| 31.05.2019 15:00 - 16:00 | 50 | 0 | 0 | 0 |
| 31.05.2019 16:00 - 17:00 | 50 | 0 | 0 | 0 |
| 31.05.2019 17:00 - 18:00 | 70 | 0 | 0 | 0 |
| 31.05.2019 18:00 - 19:00 | 70 | 0 | 0 | 0 |
| 31.05.2019 19:00 - 20:00 | 70 | 0 | 0 | 0 |
| 31.05.2019 20:00 - 21:00 | 70 | 0 | 0 | 0 |
| 31.05.2019 21:00 - 22:00 | 70 | 0 | 0 | 0 |
| 31.05.2019 22:00 - 23:00 | 70 | 0 | 0 | 0 |
| 31.05.2019 23:00 - 24:00 | 70 | 0 | 0 | 0 |
| 01.06.2019 00:00 - 01:00 | 70 | 0 | 0 | 0 |
| 01.06.2019 01:00 - 02:00 | 70 | 0 | 0 | 0 |
| 01.06.2019 02:00 - 03:00 | 100 | 0 | 0 | 0 |
| 01.06.2019 03:00 - 04:00 | 100 | 0 | 0 | 0 |
| 01.06.2019 04:00 - 05:00 | 100 | 0 | 0 | 0 |
| 01.06.2019 05:00 - 06:00 | 100 | 0 | 0 | 0 |